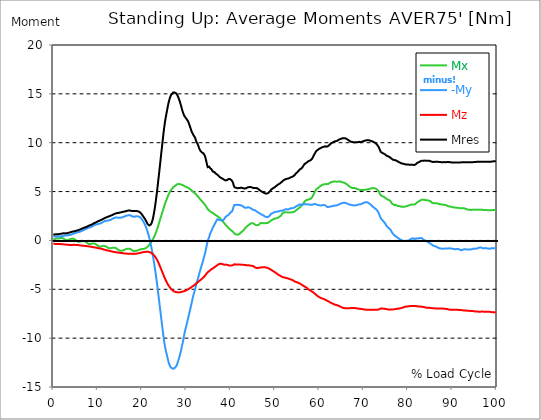
| Category |  Mx |  -My |  Mz |  Mres |
|---|---|---|---|---|
| 0.0 | 0.13 | 0.424 | -0.341 | 0.612 |
| 0.167348456675344 | 0.141 | 0.424 | -0.341 | 0.612 |
| 0.334696913350688 | 0.153 | 0.412 | -0.353 | 0.612 |
| 0.5020453700260321 | 0.177 | 0.4 | -0.353 | 0.612 |
| 0.669393826701376 | 0.2 | 0.412 | -0.353 | 0.636 |
| 0.83674228337672 | 0.2 | 0.412 | -0.353 | 0.636 |
| 1.0040907400520642 | 0.188 | 0.412 | -0.365 | 0.636 |
| 1.1621420602454444 | 0.2 | 0.4 | -0.365 | 0.636 |
| 1.3294905169207885 | 0.224 | 0.4 | -0.377 | 0.648 |
| 1.4968389735961325 | 0.247 | 0.4 | -0.377 | 0.659 |
| 1.6641874302714765 | 0.259 | 0.412 | -0.377 | 0.683 |
| 1.8315358869468206 | 0.259 | 0.412 | -0.389 | 0.683 |
| 1.9988843436221646 | 0.259 | 0.436 | -0.389 | 0.706 |
| 2.1662328002975086 | 0.224 | 0.459 | -0.4 | 0.718 |
| 2.333581256972853 | 0.177 | 0.483 | -0.4 | 0.73 |
| 2.5009297136481967 | 0.118 | 0.494 | -0.412 | 0.73 |
| 2.6682781703235405 | 0.071 | 0.494 | -0.412 | 0.718 |
| 2.8356266269988843 | 0.024 | 0.506 | -0.424 | 0.73 |
| 3.002975083674229 | 0.012 | 0.518 | -0.436 | 0.73 |
| 3.1703235403495724 | 0.012 | 0.518 | -0.436 | 0.754 |
| 3.337671997024917 | 0.035 | 0.53 | -0.447 | 0.765 |
| 3.4957233172182973 | 0.071 | 0.53 | -0.447 | 0.789 |
| 3.663071773893641 | 0.106 | 0.553 | -0.459 | 0.812 |
| 3.8304202305689854 | 0.141 | 0.565 | -0.459 | 0.836 |
| 3.997768687244329 | 0.165 | 0.589 | -0.459 | 0.859 |
| 4.165117143919673 | 0.177 | 0.624 | -0.459 | 0.883 |
| 4.332465600595017 | 0.188 | 0.659 | -0.459 | 0.907 |
| 4.499814057270361 | 0.177 | 0.683 | -0.459 | 0.918 |
| 4.667162513945706 | 0.141 | 0.706 | -0.447 | 0.93 |
| 4.834510970621049 | 0.106 | 0.742 | -0.447 | 0.942 |
| 5.001859427296393 | 0.047 | 0.765 | -0.459 | 0.965 |
| 5.169207883971737 | -0.012 | 0.801 | -0.459 | 0.977 |
| 5.336556340647081 | -0.071 | 0.824 | -0.471 | 1.013 |
| 5.503904797322425 | -0.118 | 0.836 | -0.471 | 1.024 |
| 5.671253253997769 | -0.153 | 0.859 | -0.483 | 1.06 |
| 5.82930457419115 | -0.153 | 0.871 | -0.494 | 1.083 |
| 5.996653030866494 | -0.13 | 0.895 | -0.506 | 1.118 |
| 6.164001487541838 | -0.118 | 0.93 | -0.518 | 1.142 |
| 6.331349944217181 | -0.094 | 0.954 | -0.518 | 1.177 |
| 6.498698400892526 | -0.071 | 0.989 | -0.53 | 1.213 |
| 6.66604685756787 | -0.059 | 1.024 | -0.542 | 1.248 |
| 6.833395314243213 | -0.071 | 1.071 | -0.542 | 1.283 |
| 7.000743770918558 | -0.071 | 1.107 | -0.553 | 1.319 |
| 7.168092227593902 | -0.118 | 1.142 | -0.565 | 1.342 |
| 7.335440684269246 | -0.153 | 1.177 | -0.577 | 1.354 |
| 7.50278914094459 | -0.224 | 1.213 | -0.577 | 1.389 |
| 7.6701375976199335 | -0.283 | 1.236 | -0.589 | 1.425 |
| 7.837486054295278 | -0.33 | 1.283 | -0.6 | 1.472 |
| 7.995537374488658 | -0.365 | 1.307 | -0.612 | 1.507 |
| 8.162885831164003 | -0.389 | 1.319 | -0.624 | 1.542 |
| 8.330234287839346 | -0.365 | 1.342 | -0.636 | 1.566 |
| 8.49758274451469 | -0.341 | 1.366 | -0.648 | 1.578 |
| 8.664931201190035 | -0.33 | 1.413 | -0.659 | 1.625 |
| 8.832279657865378 | -0.318 | 1.46 | -0.671 | 1.672 |
| 8.999628114540721 | -0.318 | 1.507 | -0.695 | 1.719 |
| 9.166976571216066 | -0.33 | 1.554 | -0.706 | 1.766 |
| 9.334325027891412 | -0.33 | 1.589 | -0.718 | 1.79 |
| 9.501673484566755 | -0.365 | 1.601 | -0.73 | 1.825 |
| 9.669021941242098 | -0.412 | 1.625 | -0.742 | 1.86 |
| 9.836370397917442 | -0.483 | 1.648 | -0.754 | 1.907 |
| 10.003718854592787 | -0.53 | 1.672 | -0.777 | 1.943 |
| 10.17106731126813 | -0.577 | 1.684 | -0.789 | 1.978 |
| 10.329118631461512 | -0.612 | 1.707 | -0.812 | 2.013 |
| 10.496467088136853 | -0.636 | 1.731 | -0.824 | 2.049 |
| 10.663815544812199 | -0.624 | 1.754 | -0.836 | 2.072 |
| 10.831164001487544 | -0.612 | 1.79 | -0.859 | 2.107 |
| 10.998512458162887 | -0.589 | 1.825 | -0.871 | 2.143 |
| 11.16586091483823 | -0.565 | 1.872 | -0.895 | 2.178 |
| 11.333209371513574 | -0.553 | 1.919 | -0.918 | 2.225 |
| 11.50055782818892 | -0.553 | 1.954 | -0.942 | 2.261 |
| 11.667906284864264 | -0.577 | 1.99 | -0.965 | 2.308 |
| 11.835254741539607 | -0.6 | 2.013 | -0.977 | 2.343 |
| 12.00260319821495 | -0.648 | 2.025 | -1.001 | 2.366 |
| 12.169951654890292 | -0.706 | 2.025 | -1.013 | 2.402 |
| 12.337300111565641 | -0.754 | 2.037 | -1.036 | 2.425 |
| 12.504648568240984 | -0.777 | 2.049 | -1.048 | 2.449 |
| 12.662699888434362 | -0.801 | 2.06 | -1.071 | 2.484 |
| 12.830048345109708 | -0.801 | 2.096 | -1.095 | 2.52 |
| 12.997396801785053 | -0.789 | 2.131 | -1.107 | 2.543 |
| 13.164745258460396 | -0.777 | 2.166 | -1.118 | 2.578 |
| 13.33209371513574 | -0.754 | 2.213 | -1.142 | 2.614 |
| 13.499442171811083 | -0.742 | 2.261 | -1.154 | 2.661 |
| 13.666790628486426 | -0.742 | 2.284 | -1.177 | 2.684 |
| 13.834139085161771 | -0.742 | 2.319 | -1.189 | 2.731 |
| 14.001487541837117 | -0.754 | 2.343 | -1.201 | 2.755 |
| 14.16883599851246 | -0.812 | 2.355 | -1.213 | 2.779 |
| 14.336184455187803 | -0.859 | 2.343 | -1.224 | 2.79 |
| 14.503532911863147 | -0.918 | 2.331 | -1.236 | 2.802 |
| 14.670881368538492 | -0.965 | 2.319 | -1.248 | 2.814 |
| 14.828932688731873 | -1.013 | 2.308 | -1.26 | 2.826 |
| 14.996281145407215 | -1.048 | 2.319 | -1.272 | 2.849 |
| 15.163629602082558 | -1.071 | 2.343 | -1.272 | 2.885 |
| 15.330978058757903 | -1.06 | 2.343 | -1.283 | 2.885 |
| 15.498326515433247 | -1.048 | 2.355 | -1.295 | 2.896 |
| 15.665674972108594 | -1.024 | 2.378 | -1.307 | 2.92 |
| 15.833023428783937 | -1.001 | 2.414 | -1.319 | 2.932 |
| 16.00037188545928 | -0.965 | 2.449 | -1.33 | 2.955 |
| 16.167720342134626 | -0.93 | 2.472 | -1.33 | 2.979 |
| 16.335068798809967 | -0.907 | 2.508 | -1.342 | 2.99 |
| 16.502417255485312 | -0.883 | 2.531 | -1.354 | 3.014 |
| 16.669765712160658 | -0.859 | 2.555 | -1.354 | 3.038 |
| 16.837114168836 | -0.848 | 2.578 | -1.366 | 3.049 |
| 17.004462625511344 | -0.848 | 2.59 | -1.366 | 3.061 |
| 17.16251394570472 | -0.848 | 2.59 | -1.366 | 3.061 |
| 17.32986240238007 | -0.871 | 2.567 | -1.366 | 3.049 |
| 17.497210859055414 | -0.918 | 2.531 | -1.366 | 3.038 |
| 17.664559315730756 | -0.977 | 2.496 | -1.366 | 3.026 |
| 17.8319077724061 | -1.024 | 2.472 | -1.366 | 3.014 |
| 17.999256229081443 | -1.071 | 2.437 | -1.366 | 3.002 |
| 18.166604685756788 | -1.107 | 2.414 | -1.366 | 3.002 |
| 18.333953142432133 | -1.095 | 2.425 | -1.366 | 3.014 |
| 18.501301599107478 | -1.083 | 2.449 | -1.354 | 3.014 |
| 18.668650055782823 | -1.06 | 2.472 | -1.354 | 3.026 |
| 18.835998512458165 | -1.048 | 2.461 | -1.342 | 3.002 |
| 19.00334696913351 | -1.024 | 2.461 | -1.33 | 2.99 |
| 19.170695425808855 | -0.989 | 2.472 | -1.319 | 2.979 |
| 19.338043882484197 | -0.965 | 2.437 | -1.307 | 2.943 |
| 19.496095202677576 | -0.942 | 2.414 | -1.283 | 2.908 |
| 19.66344365935292 | -0.907 | 2.343 | -1.272 | 2.826 |
| 19.830792116028263 | -0.883 | 2.261 | -1.248 | 2.743 |
| 19.998140572703612 | -0.883 | 2.143 | -1.224 | 2.637 |
| 20.165489029378953 | -0.871 | 2.013 | -1.213 | 2.531 |
| 20.3328374860543 | -0.871 | 1.896 | -1.189 | 2.425 |
| 20.500185942729644 | -0.848 | 1.766 | -1.177 | 2.308 |
| 20.667534399404985 | -0.824 | 1.613 | -1.177 | 2.19 |
| 20.83488285608033 | -0.789 | 1.436 | -1.166 | 2.06 |
| 21.002231312755672 | -0.754 | 1.236 | -1.154 | 1.919 |
| 21.16957976943102 | -0.683 | 1.013 | -1.154 | 1.766 |
| 21.336928226106362 | -0.612 | 0.765 | -1.154 | 1.637 |
| 21.504276682781704 | -0.53 | 0.506 | -1.177 | 1.554 |
| 21.67162513945705 | -0.436 | 0.212 | -1.189 | 1.531 |
| 21.82967645965043 | -0.33 | -0.118 | -1.224 | 1.566 |
| 21.997024916325774 | -0.224 | -0.471 | -1.26 | 1.637 |
| 22.16437337300112 | -0.106 | -0.836 | -1.295 | 1.778 |
| 22.33172182967646 | 0.024 | -1.248 | -1.354 | 2.013 |
| 22.499070286351806 | 0.153 | -1.672 | -1.425 | 2.319 |
| 22.666418743027148 | 0.306 | -2.143 | -1.495 | 2.72 |
| 22.833767199702496 | 0.471 | -2.625 | -1.589 | 3.167 |
| 23.00111565637784 | 0.648 | -3.144 | -1.695 | 3.673 |
| 23.168464113053183 | 0.836 | -3.673 | -1.813 | 4.227 |
| 23.335812569728528 | 1.048 | -4.25 | -1.943 | 4.815 |
| 23.50316102640387 | 1.272 | -4.839 | -2.084 | 5.451 |
| 23.670509483079215 | 1.519 | -5.463 | -2.249 | 6.134 |
| 23.83785793975456 | 1.778 | -6.063 | -2.414 | 6.793 |
| 23.995909259947936 | 2.025 | -6.711 | -2.602 | 7.488 |
| 24.163257716623285 | 2.272 | -7.335 | -2.779 | 8.183 |
| 24.330606173298627 | 2.52 | -7.971 | -2.967 | 8.889 |
| 24.49795462997397 | 2.755 | -8.583 | -3.155 | 9.56 |
| 24.665303086649313 | 2.99 | -9.183 | -3.344 | 10.231 |
| 24.83265154332466 | 3.249 | -9.796 | -3.532 | 10.926 |
| 25.0 | 3.497 | -10.349 | -3.72 | 11.55 |
| 25.167348456675345 | 3.72 | -10.808 | -3.885 | 12.08 |
| 25.334696913350694 | 3.932 | -11.197 | -4.05 | 12.551 |
| 25.502045370026035 | 4.132 | -11.526 | -4.203 | 12.951 |
| 25.669393826701377 | 4.333 | -11.844 | -4.356 | 13.351 |
| 25.836742283376722 | 4.521 | -12.174 | -4.497 | 13.751 |
| 26.004090740052067 | 4.709 | -12.468 | -4.627 | 14.116 |
| 26.17143919672741 | 4.862 | -12.692 | -4.733 | 14.399 |
| 26.329490516920792 | 5.004 | -12.868 | -4.839 | 14.646 |
| 26.49683897359613 | 5.133 | -12.998 | -4.933 | 14.835 |
| 26.66418743027148 | 5.239 | -13.057 | -5.016 | 14.952 |
| 26.831535886946828 | 5.333 | -13.104 | -5.086 | 15.047 |
| 26.998884343622166 | 5.416 | -13.127 | -5.157 | 15.129 |
| 27.166232800297514 | 5.486 | -13.127 | -5.192 | 15.176 |
| 27.333581256972852 | 5.545 | -13.057 | -5.239 | 15.141 |
| 27.5009297136482 | 5.604 | -12.998 | -5.263 | 15.129 |
| 27.668278170323543 | 5.663 | -12.892 | -5.286 | 15.07 |
| 27.835626626998888 | 5.722 | -12.786 | -5.298 | 15.011 |
| 28.002975083674233 | 5.757 | -12.551 | -5.31 | 14.846 |
| 28.170323540349575 | 5.781 | -12.327 | -5.322 | 14.67 |
| 28.33767199702492 | 5.781 | -12.08 | -5.322 | 14.47 |
| 28.50502045370026 | 5.769 | -11.821 | -5.31 | 14.258 |
| 28.663071773893645 | 5.745 | -11.491 | -5.298 | 13.987 |
| 28.830420230568986 | 5.734 | -11.22 | -5.275 | 13.763 |
| 28.99776868724433 | 5.687 | -10.796 | -5.263 | 13.434 |
| 29.165117143919673 | 5.663 | -10.49 | -5.239 | 13.198 |
| 29.33246560059502 | 5.628 | -10.113 | -5.216 | 12.974 |
| 29.499814057270367 | 5.581 | -9.69 | -5.192 | 12.786 |
| 29.66716251394571 | 5.534 | -9.325 | -5.169 | 12.668 |
| 29.834510970621054 | 5.51 | -9.019 | -5.133 | 12.609 |
| 30.00185942729639 | 5.475 | -8.712 | -5.098 | 12.456 |
| 30.169207883971744 | 5.451 | -8.406 | -5.051 | 12.362 |
| 30.33655634064708 | 5.404 | -8.088 | -5.016 | 12.233 |
| 30.50390479732243 | 5.357 | -7.782 | -4.98 | 12.08 |
| 30.671253253997772 | 5.298 | -7.453 | -4.933 | 11.856 |
| 30.829304574191156 | 5.251 | -7.135 | -4.886 | 11.632 |
| 30.996653030866494 | 5.192 | -6.805 | -4.827 | 11.42 |
| 31.164001487541842 | 5.121 | -6.464 | -4.78 | 11.173 |
| 31.331349944217187 | 5.051 | -6.122 | -4.721 | 11.02 |
| 31.498698400892525 | 4.98 | -5.781 | -4.674 | 10.867 |
| 31.666046857567874 | 4.921 | -5.486 | -4.615 | 10.737 |
| 31.833395314243212 | 4.862 | -5.227 | -4.556 | 10.655 |
| 32.00074377091856 | 4.804 | -4.945 | -4.497 | 10.478 |
| 32.1680922275939 | 4.709 | -4.603 | -4.439 | 10.219 |
| 32.33544068426925 | 4.615 | -4.297 | -4.38 | 10.019 |
| 32.50278914094459 | 4.556 | -4.085 | -4.309 | 9.913 |
| 32.670137597619934 | 4.474 | -3.826 | -4.238 | 9.737 |
| 32.83748605429528 | 4.368 | -3.544 | -4.18 | 9.513 |
| 33.004834510970625 | 4.286 | -3.249 | -4.109 | 9.313 |
| 33.162885831164004 | 4.18 | -2.99 | -4.05 | 9.172 |
| 33.33023428783935 | 4.085 | -2.755 | -3.991 | 9.089 |
| 33.497582744514695 | 4.015 | -2.496 | -3.932 | 9.007 |
| 33.664931201190036 | 3.932 | -2.225 | -3.862 | 8.96 |
| 33.83227965786538 | 3.85 | -1.954 | -3.791 | 8.924 |
| 33.99962811454073 | 3.768 | -1.695 | -3.72 | 8.877 |
| 34.16697657121607 | 3.673 | -1.413 | -3.626 | 8.677 |
| 34.33432502789141 | 3.579 | -1.095 | -3.532 | 8.418 |
| 34.50167348456676 | 3.45 | -0.73 | -3.426 | 8.1 |
| 34.6690219412421 | 3.32 | -0.353 | -3.332 | 7.747 |
| 34.83637039791744 | 3.202 | -0.035 | -3.249 | 7.5 |
| 35.00371885459279 | 3.132 | 0.177 | -3.191 | 7.511 |
| 35.17106731126814 | 3.049 | 0.377 | -3.132 | 7.547 |
| 35.338415767943474 | 2.967 | 0.648 | -3.061 | 7.417 |
| 35.49646708813686 | 2.932 | 0.824 | -3.002 | 7.335 |
| 35.6638155448122 | 2.92 | 0.977 | -2.955 | 7.276 |
| 35.831164001487544 | 2.849 | 1.166 | -2.896 | 7.158 |
| 35.998512458162885 | 2.79 | 1.354 | -2.849 | 7.041 |
| 36.165860914838234 | 2.743 | 1.472 | -2.802 | 7.029 |
| 36.333209371513576 | 2.684 | 1.601 | -2.755 | 7.005 |
| 36.50055782818892 | 2.625 | 1.766 | -2.696 | 6.887 |
| 36.667906284864266 | 2.578 | 1.907 | -2.637 | 6.817 |
| 36.83525474153961 | 2.531 | 2.049 | -2.578 | 6.782 |
| 37.002603198214956 | 2.496 | 2.166 | -2.52 | 6.734 |
| 37.1699516548903 | 2.437 | 2.166 | -2.472 | 6.664 |
| 37.337300111565646 | 2.378 | 2.119 | -2.414 | 6.57 |
| 37.50464856824098 | 2.308 | 2.084 | -2.39 | 6.499 |
| 37.66269988843437 | 2.237 | 2.06 | -2.39 | 6.44 |
| 37.83004834510971 | 2.166 | 2.037 | -2.39 | 6.393 |
| 37.99739680178505 | 2.084 | 2.049 | -2.402 | 6.369 |
| 38.16474525846039 | 1.99 | 2.037 | -2.425 | 6.322 |
| 38.33209371513574 | 1.896 | 2.072 | -2.461 | 6.275 |
| 38.49944217181109 | 1.79 | 2.155 | -2.484 | 6.216 |
| 38.666790628486424 | 1.695 | 2.272 | -2.484 | 6.158 |
| 38.83413908516178 | 1.613 | 2.402 | -2.472 | 6.146 |
| 39.001487541837115 | 1.531 | 2.484 | -2.472 | 6.158 |
| 39.16883599851246 | 1.436 | 2.508 | -2.496 | 6.169 |
| 39.336184455187805 | 1.366 | 2.567 | -2.508 | 6.216 |
| 39.503532911863154 | 1.283 | 2.614 | -2.543 | 6.275 |
| 39.670881368538495 | 1.189 | 2.684 | -2.567 | 6.299 |
| 39.83822982521384 | 1.13 | 2.779 | -2.578 | 6.275 |
| 39.996281145407224 | 1.071 | 2.885 | -2.567 | 6.228 |
| 40.163629602082565 | 1.013 | 2.943 | -2.567 | 6.181 |
| 40.33097805875791 | 0.954 | 2.979 | -2.555 | 6.11 |
| 40.498326515433256 | 0.907 | 3.191 | -2.543 | 5.946 |
| 40.6656749721086 | 0.801 | 3.461 | -2.484 | 5.663 |
| 40.83302342878393 | 0.706 | 3.626 | -2.437 | 5.463 |
| 41.00037188545929 | 0.659 | 3.638 | -2.437 | 5.404 |
| 41.16772034213463 | 0.636 | 3.638 | -2.461 | 5.392 |
| 41.33506879880997 | 0.6 | 3.638 | -2.461 | 5.369 |
| 41.50241725548531 | 0.565 | 3.65 | -2.461 | 5.345 |
| 41.66976571216066 | 0.589 | 3.638 | -2.461 | 5.333 |
| 41.837114168836 | 0.612 | 3.626 | -2.472 | 5.357 |
| 42.004462625511344 | 0.671 | 3.638 | -2.472 | 5.369 |
| 42.17181108218669 | 0.742 | 3.614 | -2.472 | 5.38 |
| 42.32986240238007 | 0.824 | 3.567 | -2.484 | 5.38 |
| 42.497210859055414 | 0.848 | 3.556 | -2.484 | 5.38 |
| 42.66455931573076 | 0.93 | 3.509 | -2.496 | 5.357 |
| 42.831907772406105 | 1.013 | 3.461 | -2.496 | 5.345 |
| 42.999256229081446 | 1.095 | 3.403 | -2.496 | 5.322 |
| 43.16660468575679 | 1.189 | 3.355 | -2.508 | 5.31 |
| 43.33395314243214 | 1.283 | 3.308 | -2.52 | 5.31 |
| 43.50130159910748 | 1.366 | 3.332 | -2.531 | 5.345 |
| 43.66865005578282 | 1.436 | 3.367 | -2.531 | 5.38 |
| 43.83599851245817 | 1.507 | 3.391 | -2.543 | 5.428 |
| 44.00334696913351 | 1.566 | 3.403 | -2.555 | 5.463 |
| 44.17069542580886 | 1.625 | 3.379 | -2.555 | 5.463 |
| 44.3380438824842 | 1.672 | 3.332 | -2.567 | 5.451 |
| 44.49609520267758 | 1.719 | 3.297 | -2.578 | 5.463 |
| 44.66344365935292 | 1.754 | 3.249 | -2.59 | 5.451 |
| 44.83079211602827 | 1.754 | 3.191 | -2.602 | 5.416 |
| 44.99814057270361 | 1.766 | 3.144 | -2.625 | 5.38 |
| 45.16548902937895 | 1.742 | 3.12 | -2.649 | 5.357 |
| 45.332837486054295 | 1.672 | 3.108 | -2.708 | 5.345 |
| 45.500185942729644 | 1.613 | 3.085 | -2.767 | 5.357 |
| 45.66753439940499 | 1.578 | 3.038 | -2.802 | 5.369 |
| 45.83488285608033 | 1.542 | 2.967 | -2.814 | 5.357 |
| 46.00223131275568 | 1.542 | 2.908 | -2.826 | 5.31 |
| 46.16957976943102 | 1.542 | 2.873 | -2.814 | 5.286 |
| 46.336928226106366 | 1.601 | 2.826 | -2.802 | 5.227 |
| 46.50427668278171 | 1.684 | 2.779 | -2.79 | 5.157 |
| 46.671625139457056 | 1.754 | 2.731 | -2.779 | 5.11 |
| 46.829676459650436 | 1.79 | 2.684 | -2.767 | 5.051 |
| 46.99702491632577 | 1.79 | 2.625 | -2.755 | 4.992 |
| 47.16437337300112 | 1.754 | 2.614 | -2.743 | 4.957 |
| 47.33172182967646 | 1.754 | 2.567 | -2.743 | 4.91 |
| 47.49907028635181 | 1.754 | 2.52 | -2.743 | 4.874 |
| 47.66641874302716 | 1.754 | 2.472 | -2.743 | 4.839 |
| 47.83376719970249 | 1.766 | 2.425 | -2.755 | 4.804 |
| 48.001115656377834 | 1.778 | 2.39 | -2.767 | 4.78 |
| 48.16846411305319 | 1.79 | 2.378 | -2.79 | 4.792 |
| 48.33581256972853 | 1.79 | 2.39 | -2.814 | 4.815 |
| 48.50316102640387 | 1.837 | 2.414 | -2.849 | 4.862 |
| 48.67050948307921 | 1.884 | 2.461 | -2.896 | 4.921 |
| 48.837857939754564 | 1.943 | 2.555 | -2.932 | 5.016 |
| 49.005206396429905 | 2.001 | 2.649 | -2.979 | 5.11 |
| 49.163257716623285 | 2.06 | 2.743 | -3.014 | 5.216 |
| 49.33060617329863 | 2.096 | 2.779 | -3.061 | 5.275 |
| 49.49795462997397 | 2.131 | 2.802 | -3.12 | 5.322 |
| 49.66530308664932 | 2.19 | 2.861 | -3.167 | 5.369 |
| 49.832651543324666 | 2.225 | 2.885 | -3.214 | 5.416 |
| 50.0 | 2.237 | 2.896 | -3.261 | 5.475 |
| 50.16734845667534 | 2.272 | 2.932 | -3.308 | 5.534 |
| 50.33469691335069 | 2.272 | 2.943 | -3.367 | 5.592 |
| 50.50204537002604 | 2.284 | 2.943 | -3.426 | 5.651 |
| 50.66939382670139 | 2.319 | 2.955 | -3.485 | 5.71 |
| 50.836742283376715 | 2.39 | 2.979 | -3.532 | 5.757 |
| 51.00409074005207 | 2.437 | 2.967 | -3.579 | 5.804 |
| 51.17143919672741 | 2.484 | 3.038 | -3.614 | 5.851 |
| 51.32949051692079 | 2.531 | 3.096 | -3.65 | 5.91 |
| 51.496838973596134 | 2.661 | 3.038 | -3.697 | 5.981 |
| 51.66418743027148 | 2.779 | 3.038 | -3.732 | 6.075 |
| 51.831535886946824 | 2.826 | 3.061 | -3.768 | 6.122 |
| 51.99888434362217 | 2.861 | 3.096 | -3.791 | 6.169 |
| 52.16623280029752 | 2.873 | 3.144 | -3.803 | 6.216 |
| 52.33358125697285 | 2.885 | 3.167 | -3.826 | 6.252 |
| 52.5009297136482 | 2.885 | 3.202 | -3.838 | 6.287 |
| 52.668278170323546 | 2.873 | 3.191 | -3.85 | 6.311 |
| 52.835626626998895 | 2.861 | 3.167 | -3.873 | 6.322 |
| 53.00297508367424 | 2.861 | 3.167 | -3.909 | 6.334 |
| 53.17032354034958 | 2.849 | 3.191 | -3.932 | 6.358 |
| 53.33767199702492 | 2.849 | 3.249 | -3.968 | 6.417 |
| 53.50502045370027 | 2.861 | 3.285 | -3.979 | 6.452 |
| 53.663071773893655 | 2.873 | 3.297 | -4.003 | 6.475 |
| 53.83042023056899 | 2.885 | 3.297 | -4.038 | 6.499 |
| 53.99776868724433 | 2.896 | 3.308 | -4.062 | 6.534 |
| 54.16511714391967 | 2.908 | 3.32 | -4.109 | 6.581 |
| 54.33246560059503 | 2.932 | 3.355 | -4.168 | 6.64 |
| 54.49981405727037 | 2.979 | 3.403 | -4.215 | 6.723 |
| 54.667162513945705 | 3.049 | 3.473 | -4.238 | 6.829 |
| 54.834510970621054 | 3.12 | 3.52 | -4.262 | 6.911 |
| 55.0018594272964 | 3.167 | 3.532 | -4.297 | 6.97 |
| 55.169207883971744 | 3.226 | 3.567 | -4.321 | 7.029 |
| 55.336556340647086 | 3.285 | 3.65 | -4.344 | 7.135 |
| 55.50390479732243 | 3.344 | 3.685 | -4.38 | 7.205 |
| 55.671253253997776 | 3.414 | 3.709 | -4.427 | 7.288 |
| 55.83860171067312 | 3.485 | 3.685 | -4.474 | 7.347 |
| 55.9966530308665 | 3.556 | 3.638 | -4.509 | 7.382 |
| 56.16400148754184 | 3.65 | 3.626 | -4.568 | 7.464 |
| 56.33134994421718 | 3.744 | 3.685 | -4.627 | 7.582 |
| 56.498698400892536 | 3.862 | 3.72 | -4.674 | 7.712 |
| 56.66604685756788 | 3.979 | 3.732 | -4.721 | 7.818 |
| 56.83339531424321 | 4.05 | 3.697 | -4.756 | 7.865 |
| 57.00074377091856 | 4.109 | 3.697 | -4.804 | 7.924 |
| 57.16809222759391 | 4.144 | 3.697 | -4.851 | 7.971 |
| 57.33544068426925 | 4.156 | 3.685 | -4.91 | 8.03 |
| 57.5027891409446 | 4.156 | 3.685 | -4.992 | 8.077 |
| 57.670137597619934 | 4.203 | 3.697 | -5.039 | 8.147 |
| 57.83748605429528 | 4.227 | 3.662 | -5.086 | 8.171 |
| 58.004834510970625 | 4.25 | 3.638 | -5.145 | 8.194 |
| 58.16288583116401 | 4.286 | 3.638 | -5.18 | 8.253 |
| 58.330234287839346 | 4.392 | 3.638 | -5.204 | 8.336 |
| 58.497582744514695 | 4.533 | 3.673 | -5.263 | 8.477 |
| 58.66493120119004 | 4.674 | 3.709 | -5.333 | 8.63 |
| 58.832279657865385 | 4.827 | 3.72 | -5.392 | 8.771 |
| 58.999628114540734 | 4.98 | 3.709 | -5.451 | 8.913 |
| 59.16697657121607 | 5.11 | 3.709 | -5.522 | 9.042 |
| 59.33432502789142 | 5.239 | 3.673 | -5.592 | 9.16 |
| 59.50167348456676 | 5.298 | 3.65 | -5.651 | 9.219 |
| 59.66902194124211 | 5.357 | 3.638 | -5.71 | 9.278 |
| 59.83637039791745 | 5.416 | 3.614 | -5.757 | 9.336 |
| 60.00371885459278 | 5.475 | 3.591 | -5.816 | 9.383 |
| 60.17106731126813 | 5.522 | 3.579 | -5.851 | 9.419 |
| 60.33841576794349 | 5.581 | 3.591 | -5.887 | 9.466 |
| 60.49646708813685 | 5.663 | 3.591 | -5.922 | 9.501 |
| 60.6638155448122 | 5.698 | 3.603 | -5.946 | 9.537 |
| 60.831164001487544 | 5.722 | 3.614 | -5.969 | 9.56 |
| 60.99851245816289 | 5.734 | 3.626 | -5.993 | 9.584 |
| 61.16586091483824 | 5.757 | 3.614 | -6.028 | 9.607 |
| 61.333209371513576 | 5.769 | 3.603 | -6.075 | 9.631 |
| 61.50055782818892 | 5.757 | 3.544 | -6.11 | 9.607 |
| 61.667906284864266 | 5.757 | 3.45 | -6.146 | 9.595 |
| 61.835254741539615 | 5.769 | 3.414 | -6.181 | 9.619 |
| 62.002603198214956 | 5.781 | 3.414 | -6.216 | 9.654 |
| 62.16995165489029 | 5.84 | 3.438 | -6.264 | 9.737 |
| 62.33730011156564 | 5.875 | 3.438 | -6.311 | 9.796 |
| 62.504648568240995 | 5.91 | 3.461 | -6.358 | 9.866 |
| 62.67199702491633 | 5.969 | 3.497 | -6.393 | 9.949 |
| 62.83004834510971 | 5.981 | 3.509 | -6.428 | 9.984 |
| 62.99739680178505 | 5.993 | 3.509 | -6.464 | 10.019 |
| 63.1647452584604 | 6.016 | 3.52 | -6.499 | 10.066 |
| 63.33209371513575 | 6.04 | 3.567 | -6.534 | 10.113 |
| 63.4994421718111 | 6.04 | 3.579 | -6.57 | 10.149 |
| 63.666790628486424 | 6.028 | 3.579 | -6.581 | 10.161 |
| 63.83413908516177 | 6.004 | 3.567 | -6.605 | 10.161 |
| 64.00148754183712 | 6.004 | 3.579 | -6.628 | 10.184 |
| 64.16883599851248 | 6.016 | 3.626 | -6.652 | 10.231 |
| 64.3361844551878 | 6.04 | 3.685 | -6.676 | 10.29 |
| 64.50353291186315 | 6.04 | 3.709 | -6.723 | 10.337 |
| 64.6708813685385 | 6.028 | 3.744 | -6.758 | 10.361 |
| 64.83822982521384 | 6.004 | 3.768 | -6.793 | 10.384 |
| 65.00557828188919 | 5.993 | 3.791 | -6.829 | 10.42 |
| 65.16362960208257 | 5.969 | 3.826 | -6.864 | 10.443 |
| 65.3309780587579 | 5.934 | 3.85 | -6.899 | 10.467 |
| 65.49832651543326 | 5.91 | 3.862 | -6.923 | 10.478 |
| 65.6656749721086 | 5.899 | 3.862 | -6.935 | 10.467 |
| 65.83302342878395 | 5.851 | 3.85 | -6.935 | 10.455 |
| 66.00037188545929 | 5.816 | 3.838 | -6.946 | 10.431 |
| 66.16772034213463 | 5.757 | 3.791 | -6.946 | 10.384 |
| 66.33506879880998 | 5.698 | 3.768 | -6.946 | 10.337 |
| 66.50241725548531 | 5.628 | 3.732 | -6.946 | 10.278 |
| 66.66976571216065 | 5.569 | 3.709 | -6.946 | 10.231 |
| 66.83711416883601 | 5.51 | 3.662 | -6.946 | 10.172 |
| 67.00446262551135 | 5.463 | 3.638 | -6.935 | 10.125 |
| 67.1718110821867 | 5.416 | 3.638 | -6.911 | 10.09 |
| 67.32986240238007 | 5.38 | 3.626 | -6.911 | 10.078 |
| 67.49721085905541 | 5.38 | 3.603 | -6.911 | 10.066 |
| 67.66455931573076 | 5.369 | 3.579 | -6.911 | 10.055 |
| 67.83190777240611 | 5.357 | 3.579 | -6.911 | 10.055 |
| 67.99925622908145 | 5.357 | 3.591 | -6.923 | 10.055 |
| 68.16660468575678 | 5.333 | 3.603 | -6.935 | 10.066 |
| 68.33395314243214 | 5.31 | 3.614 | -6.935 | 10.055 |
| 68.50130159910749 | 5.275 | 3.614 | -6.946 | 10.055 |
| 68.66865005578282 | 5.239 | 3.626 | -6.958 | 10.055 |
| 68.83599851245816 | 5.216 | 3.673 | -6.982 | 10.066 |
| 69.00334696913352 | 5.192 | 3.709 | -6.993 | 10.09 |
| 69.17069542580886 | 5.18 | 3.697 | -6.993 | 10.078 |
| 69.3380438824842 | 5.157 | 3.685 | -6.993 | 10.055 |
| 69.50539233915956 | 5.145 | 3.72 | -7.017 | 10.078 |
| 69.66344365935292 | 5.157 | 3.768 | -7.029 | 10.113 |
| 69.83079211602826 | 5.145 | 3.815 | -7.041 | 10.137 |
| 69.99814057270362 | 5.157 | 3.85 | -7.052 | 10.161 |
| 70.16548902937896 | 5.169 | 3.873 | -7.064 | 10.196 |
| 70.33283748605429 | 5.18 | 3.897 | -7.088 | 10.219 |
| 70.50018594272964 | 5.18 | 3.921 | -7.088 | 10.243 |
| 70.667534399405 | 5.204 | 3.909 | -7.099 | 10.255 |
| 70.83488285608033 | 5.216 | 3.897 | -7.099 | 10.266 |
| 71.00223131275568 | 5.239 | 3.873 | -7.088 | 10.266 |
| 71.16957976943102 | 5.251 | 3.815 | -7.099 | 10.243 |
| 71.33692822610637 | 5.275 | 3.768 | -7.099 | 10.231 |
| 71.50427668278171 | 5.298 | 3.697 | -7.099 | 10.208 |
| 71.67162513945706 | 5.322 | 3.626 | -7.088 | 10.184 |
| 71.8389735961324 | 5.345 | 3.556 | -7.088 | 10.161 |
| 71.99702491632577 | 5.357 | 3.485 | -7.088 | 10.125 |
| 72.16437337300113 | 5.345 | 3.414 | -7.088 | 10.078 |
| 72.33172182967647 | 5.345 | 3.355 | -7.088 | 10.055 |
| 72.49907028635181 | 5.333 | 3.297 | -7.088 | 10.007 |
| 72.66641874302715 | 5.322 | 3.238 | -7.099 | 9.972 |
| 72.8337671997025 | 5.275 | 3.179 | -7.099 | 9.913 |
| 73.00111565637783 | 5.204 | 3.096 | -7.088 | 9.807 |
| 73.16846411305319 | 5.121 | 2.99 | -7.088 | 9.713 |
| 73.33581256972853 | 5.063 | 2.849 | -7.088 | 9.607 |
| 73.50316102640387 | 4.933 | 2.684 | -7.052 | 9.442 |
| 73.67050948307921 | 4.78 | 2.496 | -7.005 | 9.266 |
| 73.83785793975457 | 4.639 | 2.308 | -6.97 | 9.077 |
| 74.00520639642991 | 4.568 | 2.178 | -6.97 | 8.995 |
| 74.16325771662328 | 4.533 | 2.084 | -6.97 | 8.96 |
| 74.33060617329863 | 4.509 | 2.013 | -6.97 | 8.936 |
| 74.49795462997398 | 4.474 | 1.931 | -6.982 | 8.889 |
| 74.66530308664932 | 4.439 | 1.848 | -6.993 | 8.854 |
| 74.83265154332466 | 4.38 | 1.754 | -7.005 | 8.807 |
| 75.00000000000001 | 4.321 | 1.625 | -7.017 | 8.736 |
| 75.16734845667534 | 4.262 | 1.495 | -7.029 | 8.677 |
| 75.3346969133507 | 4.215 | 1.401 | -7.052 | 8.642 |
| 75.50204537002605 | 4.168 | 1.319 | -7.064 | 8.606 |
| 75.66939382670138 | 4.144 | 1.272 | -7.064 | 8.583 |
| 75.83674228337672 | 4.109 | 1.201 | -7.064 | 8.536 |
| 76.00409074005208 | 4.05 | 1.118 | -7.064 | 8.489 |
| 76.17143919672742 | 3.956 | 1.024 | -7.076 | 8.418 |
| 76.33878765340276 | 3.791 | 0.859 | -7.064 | 8.324 |
| 76.49683897359614 | 3.72 | 0.754 | -7.064 | 8.289 |
| 76.66418743027148 | 3.685 | 0.671 | -7.052 | 8.265 |
| 76.83153588694682 | 3.638 | 0.565 | -7.041 | 8.23 |
| 76.99888434362218 | 3.614 | 0.471 | -7.029 | 8.206 |
| 77.16623280029752 | 3.626 | 0.436 | -7.029 | 8.206 |
| 77.33358125697285 | 3.614 | 0.389 | -7.017 | 8.194 |
| 77.5009297136482 | 3.556 | 0.341 | -6.993 | 8.135 |
| 77.66827817032356 | 3.52 | 0.271 | -6.993 | 8.088 |
| 77.83562662699889 | 3.485 | 0.235 | -6.982 | 8.041 |
| 78.00297508367423 | 3.52 | 0.165 | -6.958 | 8.018 |
| 78.17032354034959 | 3.497 | 0.106 | -6.946 | 7.971 |
| 78.33767199702493 | 3.473 | 0.071 | -6.935 | 7.935 |
| 78.50502045370027 | 3.45 | 0.047 | -6.923 | 7.888 |
| 78.67236891037561 | 3.438 | 0.024 | -6.899 | 7.865 |
| 78.83042023056899 | 3.438 | -0.035 | -6.864 | 7.853 |
| 78.99776868724433 | 3.45 | -0.059 | -6.84 | 7.853 |
| 79.16511714391969 | 3.461 | -0.059 | -6.817 | 7.818 |
| 79.33246560059503 | 3.461 | -0.059 | -6.782 | 7.794 |
| 79.49981405727036 | 3.485 | -0.047 | -6.77 | 7.771 |
| 79.66716251394571 | 3.497 | -0.035 | -6.758 | 7.759 |
| 79.83451097062107 | 3.509 | -0.024 | -6.758 | 7.759 |
| 80.00185942729641 | 3.544 | -0.012 | -6.746 | 7.759 |
| 80.16920788397174 | 3.591 | -0.012 | -6.734 | 7.759 |
| 80.33655634064709 | 3.614 | 0.047 | -6.734 | 7.747 |
| 80.50390479732243 | 3.626 | 0.106 | -6.723 | 7.735 |
| 80.67125325399778 | 3.65 | 0.141 | -6.723 | 7.735 |
| 80.83860171067312 | 3.685 | 0.177 | -6.711 | 7.735 |
| 80.99665303086651 | 3.685 | 0.224 | -6.711 | 7.735 |
| 81.16400148754184 | 3.685 | 0.224 | -6.711 | 7.735 |
| 81.3313499442172 | 3.685 | 0.165 | -6.711 | 7.735 |
| 81.49869840089255 | 3.685 | 0.13 | -6.711 | 7.723 |
| 81.66604685756786 | 3.709 | 0.165 | -6.711 | 7.759 |
| 81.83339531424322 | 3.779 | 0.212 | -6.723 | 7.829 |
| 82.00074377091858 | 3.862 | 0.212 | -6.734 | 7.9 |
| 82.16809222759392 | 3.932 | 0.2 | -6.746 | 7.959 |
| 82.33544068426926 | 3.979 | 0.212 | -6.746 | 7.982 |
| 82.50278914094459 | 4.015 | 0.224 | -6.758 | 8.018 |
| 82.67013759761994 | 4.05 | 0.235 | -6.758 | 8.041 |
| 82.83748605429528 | 4.109 | 0.259 | -6.77 | 8.112 |
| 83.00483451097062 | 4.156 | 0.259 | -6.793 | 8.147 |
| 83.17218296764597 | 4.168 | 0.212 | -6.793 | 8.159 |
| 83.33023428783935 | 4.156 | 0.13 | -6.793 | 8.159 |
| 83.4975827445147 | 4.156 | 0.071 | -6.805 | 8.159 |
| 83.66493120119004 | 4.156 | 0.047 | -6.817 | 8.171 |
| 83.83227965786537 | 4.144 | 0 | -6.852 | 8.171 |
| 83.99962811454073 | 4.121 | -0.047 | -6.876 | 8.171 |
| 84.16697657121607 | 4.109 | -0.071 | -6.887 | 8.159 |
| 84.33432502789142 | 4.109 | -0.082 | -6.899 | 8.159 |
| 84.50167348456677 | 4.097 | -0.153 | -6.899 | 8.159 |
| 84.6690219412421 | 4.074 | -0.224 | -6.899 | 8.159 |
| 84.83637039791745 | 4.062 | -0.259 | -6.899 | 8.147 |
| 85.0037188545928 | 4.038 | -0.283 | -6.911 | 8.135 |
| 85.17106731126813 | 3.956 | -0.353 | -6.923 | 8.088 |
| 85.33841576794349 | 3.885 | -0.424 | -6.935 | 8.053 |
| 85.50576422461883 | 3.85 | -0.471 | -6.935 | 8.041 |
| 85.66381554481221 | 3.815 | -0.53 | -6.946 | 8.03 |
| 85.83116400148755 | 3.803 | -0.577 | -6.946 | 8.03 |
| 85.99851245816289 | 3.815 | -0.589 | -6.958 | 8.041 |
| 86.16586091483823 | 3.826 | -0.589 | -6.958 | 8.053 |
| 86.33320937151358 | 3.815 | -0.624 | -6.958 | 8.053 |
| 86.50055782818893 | 3.803 | -0.671 | -6.97 | 8.053 |
| 86.66790628486427 | 3.779 | -0.718 | -6.97 | 8.053 |
| 86.83525474153961 | 3.768 | -0.754 | -6.97 | 8.041 |
| 87.00260319821496 | 3.732 | -0.801 | -6.97 | 8.03 |
| 87.16995165489031 | 3.709 | -0.812 | -6.97 | 8.03 |
| 87.33730011156564 | 3.697 | -0.812 | -6.97 | 8.018 |
| 87.504648568241 | 3.685 | -0.824 | -6.97 | 8.006 |
| 87.67199702491634 | 3.673 | -0.836 | -6.97 | 8.006 |
| 87.83004834510972 | 3.65 | -0.859 | -6.97 | 8.006 |
| 87.99739680178506 | 3.65 | -0.859 | -6.982 | 8.006 |
| 88.1647452584604 | 3.65 | -0.836 | -6.993 | 8.018 |
| 88.33209371513574 | 3.638 | -0.836 | -6.993 | 8.006 |
| 88.49944217181108 | 3.614 | -0.836 | -7.005 | 8.006 |
| 88.66679062848644 | 3.603 | -0.836 | -7.005 | 8.006 |
| 88.83413908516178 | 3.579 | -0.836 | -7.017 | 8.018 |
| 89.00148754183712 | 3.52 | -0.836 | -7.052 | 8.018 |
| 89.16883599851246 | 3.497 | -0.812 | -7.076 | 8.018 |
| 89.33618445518782 | 3.473 | -0.801 | -7.088 | 8.006 |
| 89.50353291186315 | 3.461 | -0.812 | -7.088 | 8.006 |
| 89.6708813685385 | 3.45 | -0.824 | -7.088 | 7.994 |
| 89.83822982521386 | 3.438 | -0.836 | -7.088 | 7.982 |
| 90.00557828188919 | 3.414 | -0.836 | -7.088 | 7.982 |
| 90.16362960208257 | 3.391 | -0.859 | -7.088 | 7.982 |
| 90.3309780587579 | 3.379 | -0.883 | -7.088 | 7.982 |
| 90.49832651543326 | 3.379 | -0.895 | -7.088 | 7.982 |
| 90.66567497210859 | 3.367 | -0.907 | -7.088 | 7.971 |
| 90.83302342878395 | 3.355 | -0.895 | -7.099 | 7.971 |
| 91.00037188545929 | 3.344 | -0.883 | -7.099 | 7.971 |
| 91.16772034213463 | 3.344 | -0.871 | -7.099 | 7.971 |
| 91.33506879880998 | 3.332 | -0.871 | -7.111 | 7.971 |
| 91.50241725548533 | 3.32 | -0.895 | -7.111 | 7.971 |
| 91.66976571216065 | 3.308 | -0.942 | -7.111 | 7.971 |
| 91.83711416883601 | 3.297 | -0.977 | -7.123 | 7.982 |
| 92.00446262551137 | 3.297 | -1.001 | -7.135 | 7.994 |
| 92.1718110821867 | 3.297 | -1.001 | -7.135 | 8.006 |
| 92.33915953886203 | 3.308 | -0.965 | -7.147 | 8.006 |
| 92.49721085905541 | 3.297 | -0.918 | -7.158 | 8.006 |
| 92.66455931573077 | 3.285 | -0.895 | -7.158 | 8.006 |
| 92.83190777240611 | 3.261 | -0.907 | -7.17 | 8.006 |
| 92.99925622908145 | 3.238 | -0.918 | -7.17 | 8.006 |
| 93.1666046857568 | 3.202 | -0.918 | -7.182 | 7.994 |
| 93.33395314243214 | 3.179 | -0.918 | -7.194 | 7.994 |
| 93.50130159910749 | 3.167 | -0.918 | -7.194 | 7.994 |
| 93.66865005578283 | 3.144 | -0.918 | -7.205 | 7.994 |
| 93.83599851245818 | 3.132 | -0.918 | -7.205 | 7.994 |
| 94.00334696913353 | 3.132 | -0.918 | -7.217 | 7.994 |
| 94.17069542580886 | 3.12 | -0.918 | -7.217 | 7.994 |
| 94.3380438824842 | 3.12 | -0.907 | -7.229 | 8.006 |
| 94.50539233915954 | 3.132 | -0.895 | -7.229 | 8.006 |
| 94.66344365935292 | 3.144 | -0.848 | -7.241 | 8.006 |
| 94.83079211602828 | 3.155 | -0.836 | -7.241 | 8.018 |
| 94.99814057270362 | 3.155 | -0.836 | -7.252 | 8.03 |
| 95.16548902937897 | 3.155 | -0.848 | -7.264 | 8.03 |
| 95.33283748605432 | 3.144 | -0.848 | -7.264 | 8.041 |
| 95.50018594272963 | 3.144 | -0.836 | -7.276 | 8.041 |
| 95.66753439940499 | 3.144 | -0.812 | -7.276 | 8.041 |
| 95.83488285608034 | 3.144 | -0.777 | -7.288 | 8.041 |
| 96.00223131275567 | 3.155 | -0.754 | -7.288 | 8.053 |
| 96.16957976943102 | 3.155 | -0.73 | -7.288 | 8.053 |
| 96.33692822610638 | 3.144 | -0.706 | -7.3 | 8.053 |
| 96.50427668278171 | 3.144 | -0.73 | -7.288 | 8.053 |
| 96.67162513945706 | 3.155 | -0.754 | -7.276 | 8.041 |
| 96.8389735961324 | 3.132 | -0.789 | -7.276 | 8.041 |
| 96.99702491632577 | 3.12 | -0.801 | -7.288 | 8.041 |
| 97.16437337300111 | 3.108 | -0.812 | -7.3 | 8.041 |
| 97.33172182967647 | 3.12 | -0.765 | -7.3 | 8.053 |
| 97.49907028635181 | 3.108 | -0.777 | -7.311 | 8.041 |
| 97.66641874302715 | 3.108 | -0.824 | -7.3 | 8.053 |
| 97.8337671997025 | 3.108 | -0.812 | -7.311 | 8.053 |
| 98.00111565637785 | 3.096 | -0.812 | -7.311 | 8.053 |
| 98.16846411305319 | 3.096 | -0.836 | -7.311 | 8.053 |
| 98.33581256972855 | 3.085 | -0.848 | -7.311 | 8.053 |
| 98.50316102640389 | 3.085 | -0.848 | -7.311 | 8.053 |
| 98.67050948307921 | 3.085 | -0.824 | -7.323 | 8.065 |
| 98.83785793975456 | 3.096 | -0.789 | -7.335 | 8.065 |
| 99.0052063964299 | 3.096 | -0.789 | -7.347 | 8.077 |
| 99.17255485310525 | 3.096 | -0.789 | -7.347 | 8.088 |
| 99.33060617329863 | 3.12 | -0.801 | -7.347 | 8.1 |
| 99.49795462997399 | 3.12 | -0.789 | -7.358 | 8.1 |
| 99.66530308664933 | 3.12 | -0.812 | -7.37 | 8.112 |
| 99.83265154332467 | 3.12 | -0.836 | -7.37 | 8.112 |
| 100.0 | 3.12 | -0.836 | -7.37 | 8.124 |